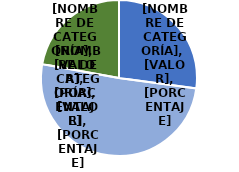
| Category | N° |
|---|---|
| Si | 38 |
| No | 71 |
| Sin información | 31 |